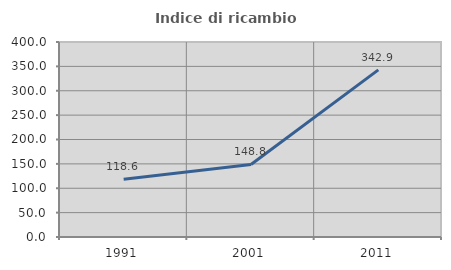
| Category | Indice di ricambio occupazionale  |
|---|---|
| 1991.0 | 118.643 |
| 2001.0 | 148.845 |
| 2011.0 | 342.903 |